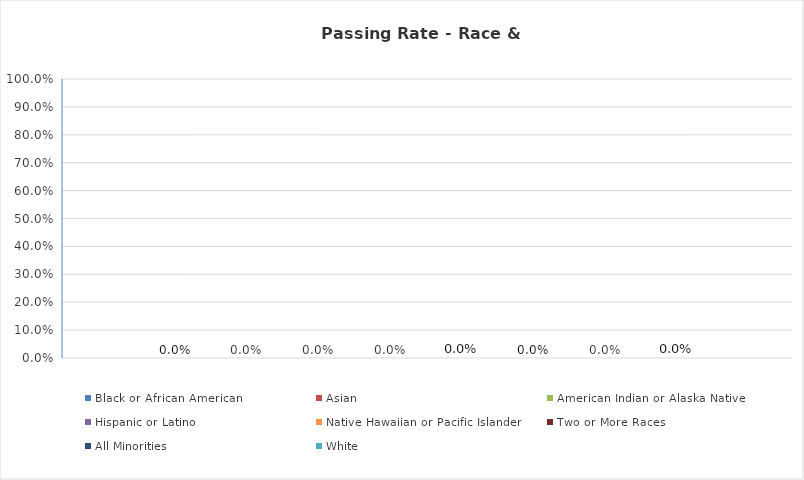
| Category | Black or African American  | Asian | American Indian or Alaska Native | Hispanic or Latino | Native Hawaiian or Pacific Islander | Two or More Races | All Minorities | White |
|---|---|---|---|---|---|---|---|---|
| Passing rate percentage | 0 | 0 | 0 | 0 | 0 | 0 | 0 | 0 |